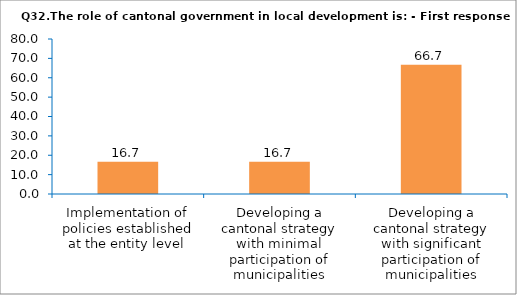
| Category | Series 0 |
|---|---|
| Implementation of policies established at the entity level | 16.667 |
| Developing a cantonal strategy with minimal participation of municipalities | 16.667 |
| Developing a cantonal strategy with significant participation of municipalities | 66.667 |